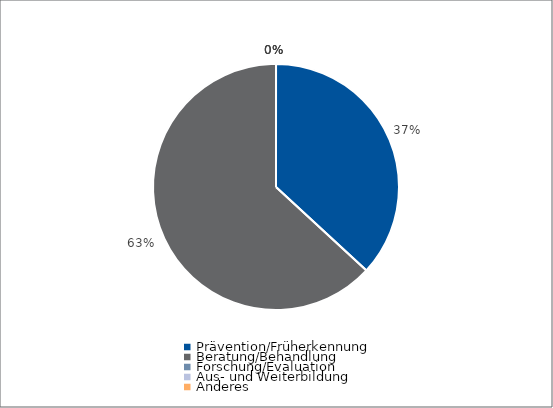
| Category | Series 0 |
|---|---|
| Prävention/Früherkennung | 5838 |
| Beratung/Behandlung | 10000 |
| Forschung/Evaluation | 0 |
| Aus- und Weiterbildung | 0 |
| Anderes | 0 |